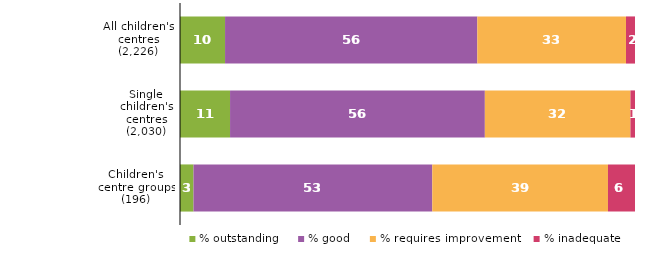
| Category | % outstanding | % good | % requires improvement | % inadequate |
|---|---|---|---|---|
| All children's centres (2,226) | 10 | 56 | 33 | 2 |
| Single children's centres (2,030) | 11 | 56 | 32 | 1 |
| Children's centre groups (196) | 3 | 53 | 39 | 6 |